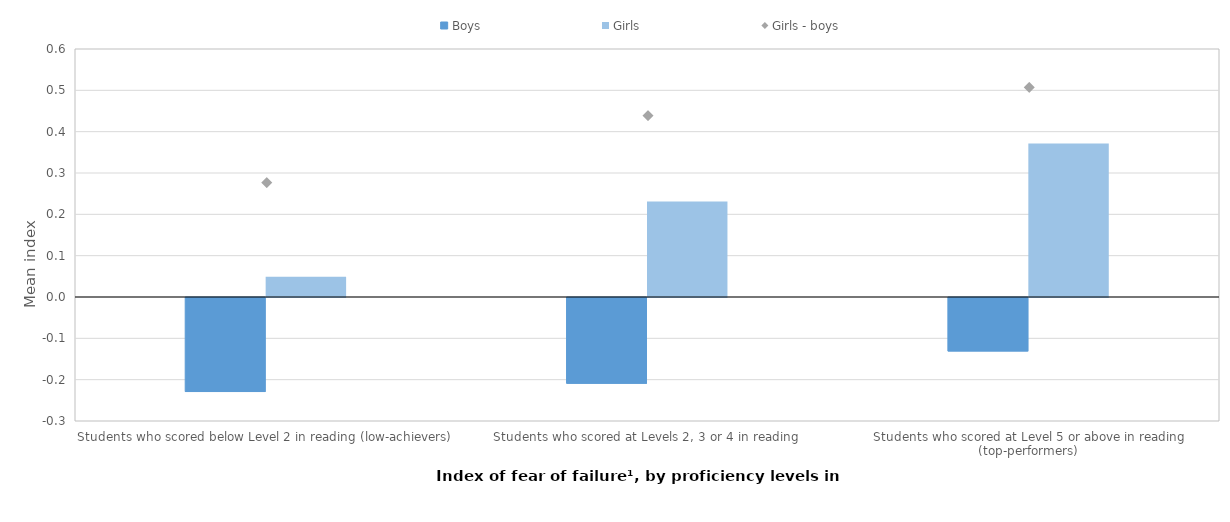
| Category | Boys | Girls |
|---|---|---|
| Students who scored below Level 2 in reading (low-achievers) | -0.228 | 0.049 |
| Students who scored at Levels 2, 3 or 4 in reading | -0.208 | 0.231 |
| Students who scored at Level 5 or above in reading (top-performers) | -0.129 | 0.372 |